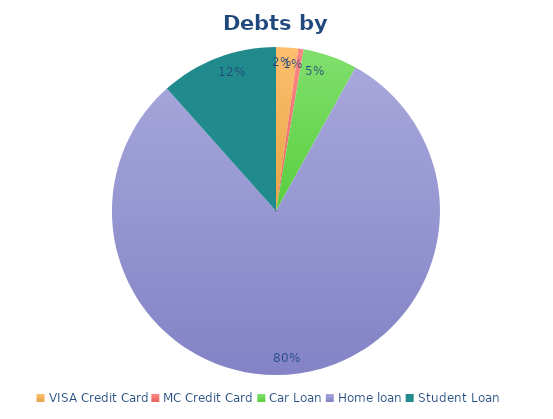
| Category | Series 0 |
|---|---|
| VISA Credit Card | 3225.34 |
| MC Credit Card | 800 |
| Car Loan | 8000 |
| Home loan | 120000 |
| Student Loan | 17312 |